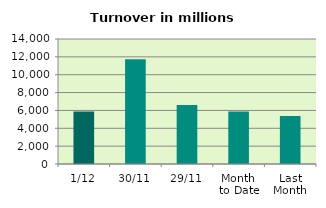
| Category | Series 0 |
|---|---|
| 1/12 | 5875.461 |
| 30/11 | 11720.407 |
| 29/11 | 6614.877 |
| Month 
to Date | 5875.461 |
| Last
Month | 5362.851 |